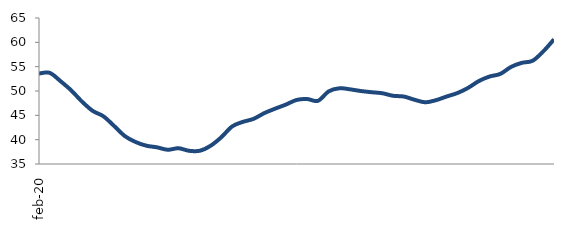
| Category | Series 0 |
|---|---|
| 2020-02-01 | 53.592 |
| 2020-03-01 | 53.724 |
| 2020-04-01 | 52.032 |
| 2020-05-01 | 50.132 |
| 2020-06-01 | 47.839 |
| 2020-07-01 | 45.923 |
| 2020-08-01 | 44.807 |
| 2020-09-01 | 42.819 |
| 2020-10-01 | 40.739 |
| 2020-11-01 | 39.526 |
| 2020-12-01 | 38.764 |
| 2021-01-01 | 38.426 |
| 2021-02-01 | 37.926 |
| 2021-03-01 | 38.241 |
| 2021-04-01 | 37.709 |
| 2021-05-01 | 37.728 |
| 2021-06-01 | 38.756 |
| 2021-07-01 | 40.518 |
| 2021-08-01 | 42.719 |
| 2021-09-01 | 43.654 |
| 2021-10-01 | 44.278 |
| 2021-11-01 | 45.454 |
| 2021-12-01 | 46.366 |
| 2022-01-01 | 47.2 |
| 2022-02-01 | 48.15 |
| 2022-03-01 | 48.353 |
| 2022-04-01 | 47.979 |
| 2022-05-01 | 49.924 |
| 2022-06-01 | 50.56 |
| 2022-07-01 | 50.34 |
| 2022-08-01 | 49.995 |
| 2022-09-01 | 49.749 |
| 2022-10-01 | 49.539 |
| 2022-11-01 | 49.017 |
| 2022-12-01 | 48.863 |
| 2023-01-01 | 48.201 |
| 2023-02-01 | 47.68 |
| 2023-03-01 | 48.113 |
| 2023-04-01 | 48.873 |
| 2023-05-01 | 49.582 |
| 2023-06-01 | 50.651 |
| 2023-07-01 | 52.053 |
| 2023-08-01 | 52.98 |
| 2023-09-01 | 53.515 |
| 2023-10-01 | 54.955 |
| 2023-11-01 | 55.788 |
| 2023-12-01 | 56.211 |
| 2024-01-01 | 58.136 |
| 2024-02-01 | 60.611 |